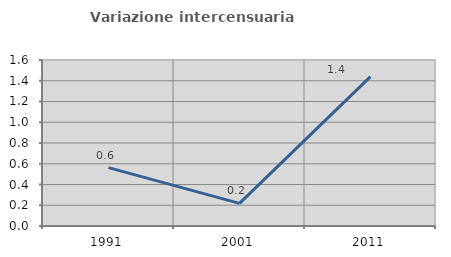
| Category | Variazione intercensuaria annua |
|---|---|
| 1991.0 | 0.563 |
| 2001.0 | 0.218 |
| 2011.0 | 1.44 |